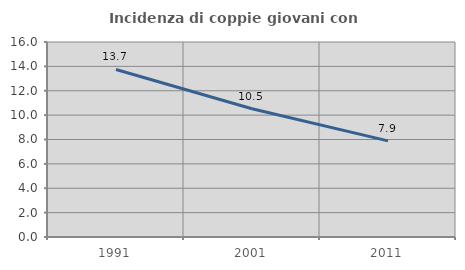
| Category | Incidenza di coppie giovani con figli |
|---|---|
| 1991.0 | 13.745 |
| 2001.0 | 10.52 |
| 2011.0 | 7.889 |